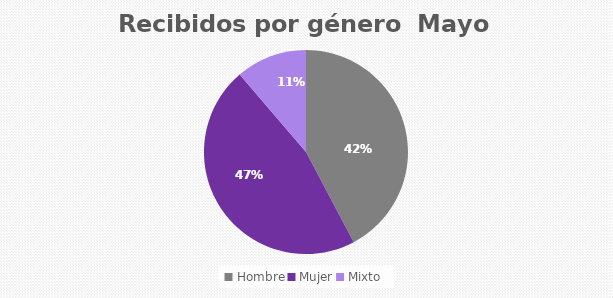
| Category | Recibidos por género  MAYO |
|---|---|
| Hombre | 60 |
| Mujer | 66 |
| Mixto | 16 |